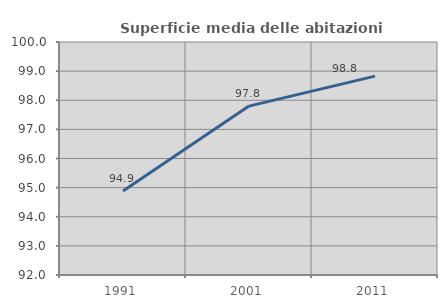
| Category | Superficie media delle abitazioni occupate |
|---|---|
| 1991.0 | 94.88 |
| 2001.0 | 97.799 |
| 2011.0 | 98.829 |